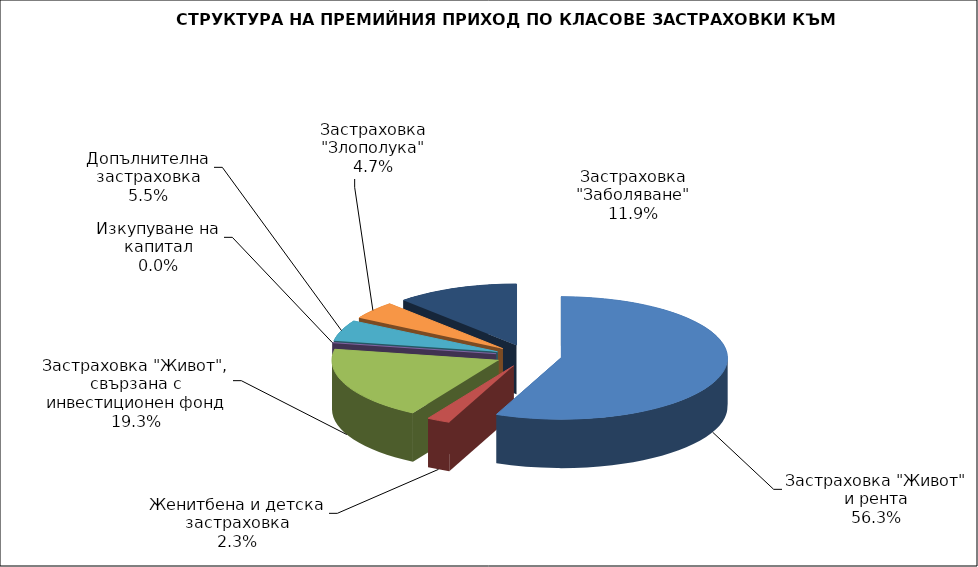
| Category | Series 0 |
|---|---|
| Застраховка "Живот" и рента | 146883533.618 |
| Женитбена и детска застраховка | 5914989.572 |
| Застраховка "Живот", свързана с инвестиционен фонд | 50338795.368 |
| Изкупуване на капитал | 0 |
| Допълнителна застраховка | 14360435.776 |
| Застраховка "Злополука" | 12282954.43 |
| Застраховка "Заболяване" | 31018847.06 |